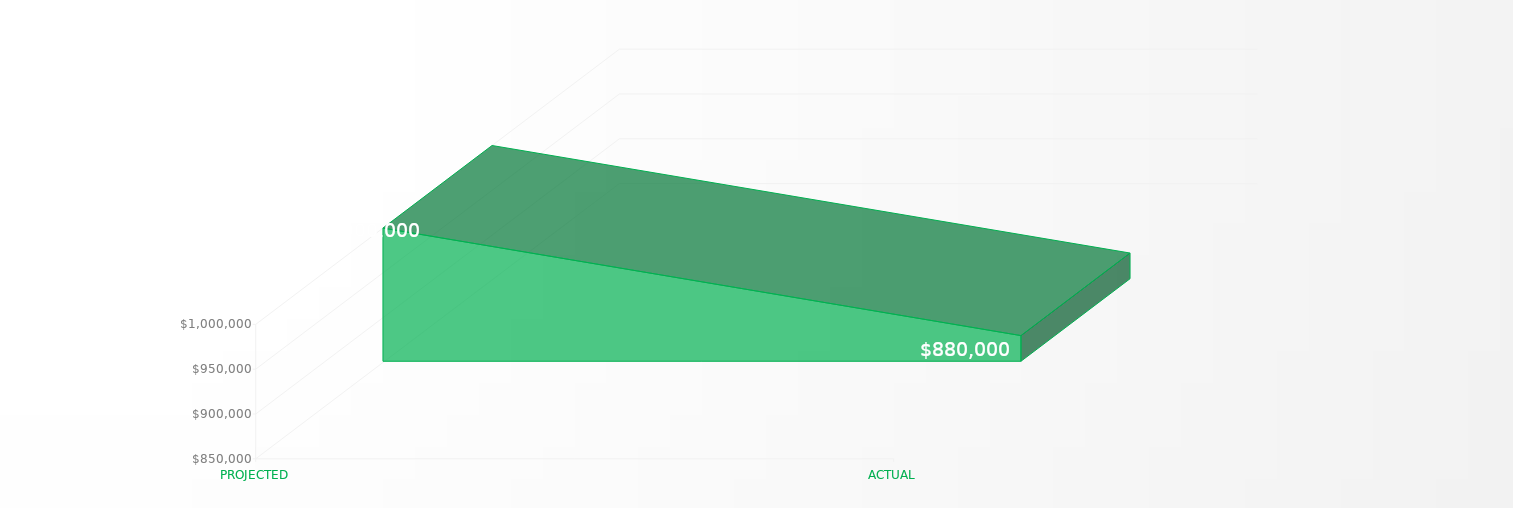
| Category | Series 0 |
|---|---|
| PROJECTED | 1000000 |
| ACTUAL | 880000 |